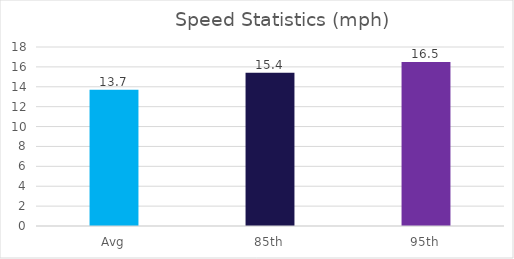
| Category | Series 0 |
|---|---|
| Avg | 13.7 |
| 85th | 15.4 |
| 95th | 16.5 |